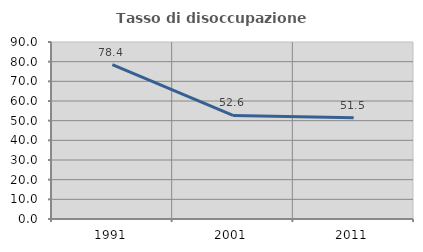
| Category | Tasso di disoccupazione giovanile  |
|---|---|
| 1991.0 | 78.448 |
| 2001.0 | 52.632 |
| 2011.0 | 51.471 |